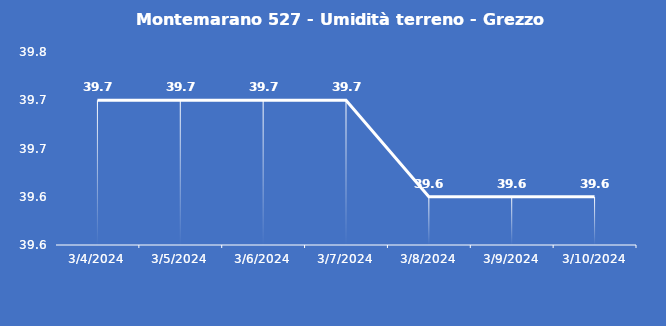
| Category | Montemarano 527 - Umidità terreno - Grezzo (%VWC) |
|---|---|
| 3/4/24 | 39.7 |
| 3/5/24 | 39.7 |
| 3/6/24 | 39.7 |
| 3/7/24 | 39.7 |
| 3/8/24 | 39.6 |
| 3/9/24 | 39.6 |
| 3/10/24 | 39.6 |